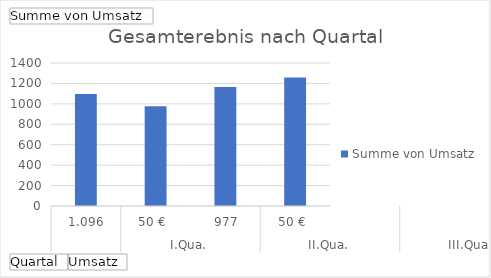
| Category | Ergebnis |
|---|---|
| 0 | 1096.5 |
| 1 | 977.5 |
| 2 | 1164.5 |
| 3 | 1258 |